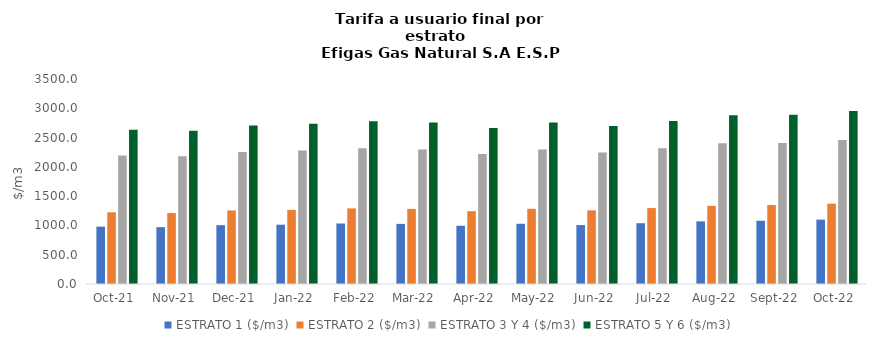
| Category | ESTRATO 1 ($/m3) | ESTRATO 2 ($/m3) | ESTRATO 3 Y 4 ($/m3) | ESTRATO 5 Y 6 ($/m3) |
|---|---|---|---|---|
| 2021-10-01 | 979.03 | 1224.42 | 2195.61 | 2634.732 |
| 2021-11-01 | 970.73 | 1211.98 | 2179.9 | 2615.88 |
| 2021-12-01 | 1004.32 | 1254.98 | 2255.58 | 2706.696 |
| 2022-01-01 | 1012.3 | 1265.26 | 2279.86 | 2735.832 |
| 2022-02-01 | 1033.14 | 1290.71 | 2316.99 | 2780.388 |
| 2022-03-01 | 1026.22 | 1281.91 | 2297.65 | 2757.18 |
| 2022-04-01 | 994.17 | 1242.89 | 2220 | 2664 |
| 2022-05-01 | 1028.01 | 1283.87 | 2296.99 | 2756.388 |
| 2022-06-01 | 1006.16 | 1257.23 | 2246.45 | 2695.74 |
| 2022-07-01 | 1037.88 | 1296.61 | 2319.21 | 2783.052 |
| 2022-08-01 | 1069.12 | 1334.67 | 2401.55 | 2881.86 |
| 2022-09-01 | 1080.05 | 1348.32 | 2407 | 2888.4 |
| 2022-10-01 | 1098.89 | 1371.9 | 2459.68 | 2951.616 |